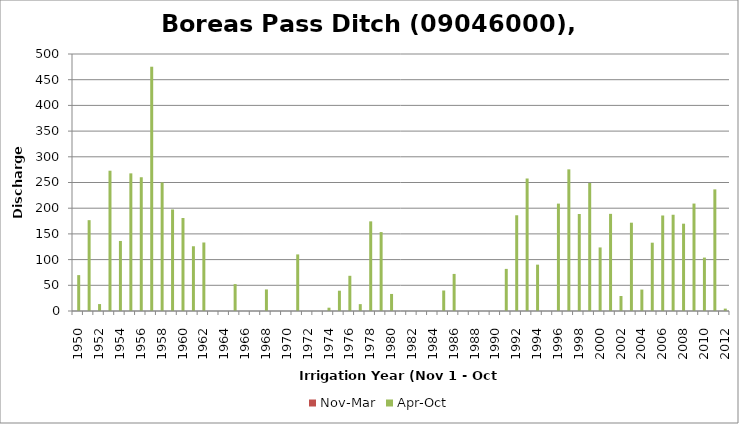
| Category | Nov-Mar | Apr-Oct |
|---|---|---|
| 1950.0 | 0 | 69.82 |
| 1951.0 | 0 | 176.73 |
| 1952.0 | 0 | 13.49 |
| 1953.0 | 0 | 272.93 |
| 1954.0 | 0 | 136.27 |
| 1955.0 | 0 | 267.78 |
| 1956.0 | 0 | 260.23 |
| 1957.0 | 0 | 475.25 |
| 1958.0 | 0 | 250.12 |
| 1959.0 | 0 | 197.56 |
| 1960.0 | 0 | 180.9 |
| 1961.0 | 0 | 125.96 |
| 1962.0 | 0 | 133.29 |
| 1963.0 | 0 | 0 |
| 1964.0 | 0 | 0 |
| 1965.0 | 0 | 52.36 |
| 1966.0 | 0 | 0 |
| 1967.0 | 0 | 0 |
| 1968.0 | 0 | 41.97 |
| 1969.0 | 0 | 0 |
| 1970.0 | 0 | 0 |
| 1971.0 | 0 | 110.1 |
| 1972.0 | 0 | 0 |
| 1973.0 | 0 | 0 |
| 1974.0 | 0 | 6.43 |
| 1975.0 | 0 | 39.47 |
| 1976.0 | 0 | 68.49 |
| 1977.0 | 0 | 13.36 |
| 1978.0 | 0 | 174.39 |
| 1979.0 | 0 | 153.55 |
| 1980.0 | 0 | 33.17 |
| 1981.0 | 0 | 0 |
| 1982.0 | 0 | 0 |
| 1983.0 | 0 | 0 |
| 1984.0 | 0 | 0 |
| 1985.0 | 0 | 39.87 |
| 1986.0 | 0 | 72.14 |
| 1987.0 | 0 | 0 |
| 1988.0 | 0 | 0 |
| 1989.0 | 0 | 0 |
| 1990.0 | 0 | 0 |
| 1991.0 | 0 | 81.94 |
| 1992.0 | 0 | 186.25 |
| 1993.0 | 0 | 257.8 |
| 1994.0 | 0 | 90.17 |
| 1995.0 | 0 | 0 |
| 1996.0 | 0 | 208.92 |
| 1997.0 | 0 | 275.57 |
| 1998.0 | 0 | 188.77 |
| 1999.0 | 0 | 249.03 |
| 2000.0 | 0 | 123.66 |
| 2001.0 | 0 | 189.01 |
| 2002.0 | 0 | 29.23 |
| 2003.0 | 0 | 171.81 |
| 2004.0 | 0 | 41.69 |
| 2005.0 | 0 | 132.9 |
| 2006.0 | 0 | 185.83 |
| 2007.0 | 0 | 187.26 |
| 2008.0 | 0 | 169.88 |
| 2009.0 | 0 | 209.03 |
| 2010.0 | 0 | 103.92 |
| 2011.0 | 0 | 236.63 |
| 2012.0 | 0 | 4.66 |